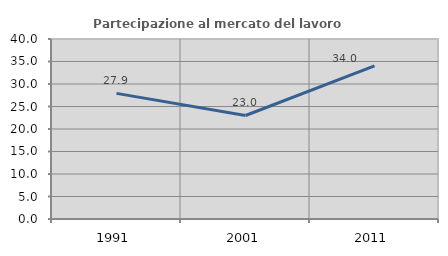
| Category | Partecipazione al mercato del lavoro  femminile |
|---|---|
| 1991.0 | 27.917 |
| 2001.0 | 23.003 |
| 2011.0 | 34.05 |